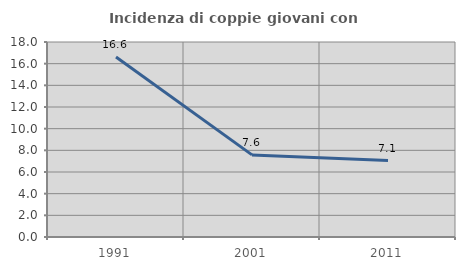
| Category | Incidenza di coppie giovani con figli |
|---|---|
| 1991.0 | 16.616 |
| 2001.0 | 7.58 |
| 2011.0 | 7.062 |